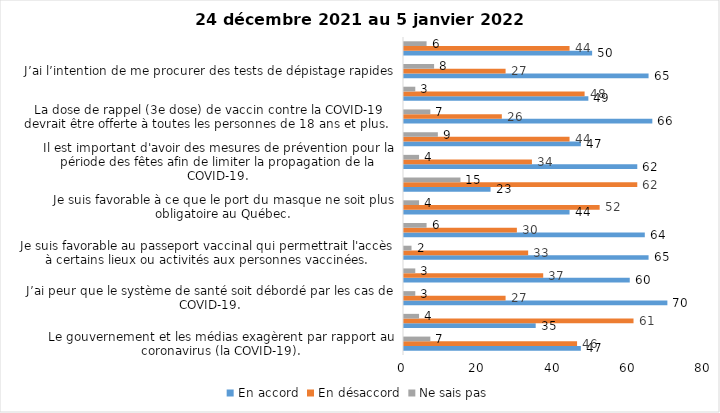
| Category | En accord | En désaccord | Ne sais pas |
|---|---|---|---|
| Le gouvernement et les médias exagèrent par rapport au coronavirus (la COVID-19). | 47 | 46 | 7 |
| Je suis favorable à la mise en place d’un couvre-feu. | 35 | 61 | 4 |
| J’ai peur que le système de santé soit débordé par les cas de COVID-19. | 70 | 27 | 3 |
| Je suis inquiet/inquiète que le nombre de cas augmente en raison des nouveaux variants du virus de la COVID-19. | 60 | 37 | 3 |
| Je suis favorable au passeport vaccinal qui permettrait l'accès à certains lieux ou activités aux personnes vaccinées. | 65 | 33 | 2 |
| Je suis confiant que la vaccination protège efficacement contre les variants de la COVID-19 | 64 | 30 | 6 |
| Je suis favorable à ce que le port du masque ne soit plus obligatoire au Québec. | 44 | 52 | 4 |
| La vaccination des enfants entre 5 et 11 ans mettra fin à la pandémie. | 23 | 62 | 15 |
| Il est important d'avoir des mesures de prévention pour la période des fêtes afin de limiter la propagation de la COVID-19. | 62 | 34 | 4 |
| La pandémie ne sera pas terminée au Québec avant que tous les habitants de la terre puissent être vaccinés contre la COVID-19.   | 47 | 44 | 9 |
| La dose de rappel (3e dose) de vaccin contre la COVID-19 devrait être offerte à toutes les personnes de 18 ans et plus.  | 66 | 26 | 7 |
| Je suis inconfortable d’être en contact avec une personne non vaccinée contre la COVID-19 | 49 | 48 | 3 |
| J’ai l’intention de me procurer des tests de dépistage rapides | 65 | 27 | 8 |
| Je n'ai pas peur du variant Omicron, car il semble moins dangereux pour la santé. | 50 | 44 | 6 |